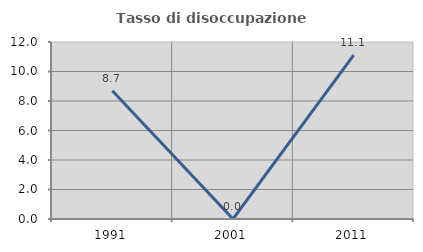
| Category | Tasso di disoccupazione giovanile  |
|---|---|
| 1991.0 | 8.696 |
| 2001.0 | 0 |
| 2011.0 | 11.111 |